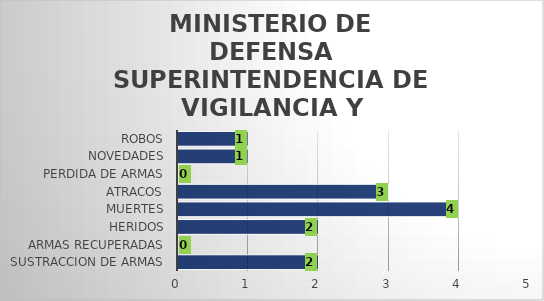
| Category | Series 1 |
|---|---|
| SUSTRACCION DE ARMAS | 2 |
| ARMAS RECUPERADAS | 0 |
| HERIDOS | 2 |
| MUERTES | 4 |
| ATRACOS | 3 |
| PERDIDA DE ARMAS | 0 |
| NOVEDADES | 1 |
| ROBOS | 1 |